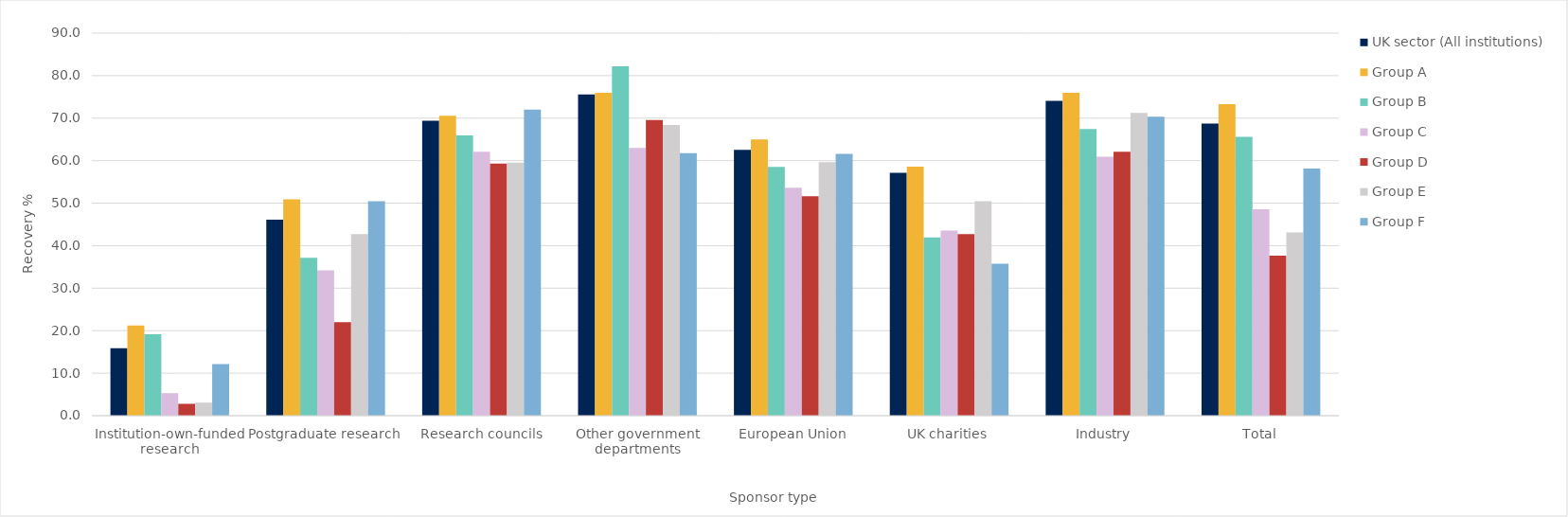
| Category | UK sector (All institutions) | Group A | Group B | Group C | Group D | Group E | Group F |
|---|---|---|---|---|---|---|---|
| 0 | 15.875 | 21.224 | 19.148 | 5.299 | 2.788 | 3.069 | 12.132 |
| 1 | 46.089 | 50.93 | 37.126 | 34.208 | 21.981 | 42.728 | 50.437 |
| 2 | 69.376 | 70.581 | 65.918 | 62.095 | 59.316 | 59.525 | 72.008 |
| 3 | 75.602 | 75.98 | 82.199 | 63.004 | 69.587 | 68.378 | 61.739 |
| 4 | 62.55 | 64.979 | 58.542 | 53.658 | 51.631 | 59.622 | 61.604 |
| 5 | 57.118 | 58.614 | 41.916 | 43.555 | 42.704 | 50.468 | 35.767 |
| 6 | 74.099 | 75.939 | 67.435 | 60.927 | 62.123 | 71.205 | 70.338 |
| 7 | 68.709 | 73.291 | 65.592 | 48.585 | 37.622 | 43.116 | 58.135 |